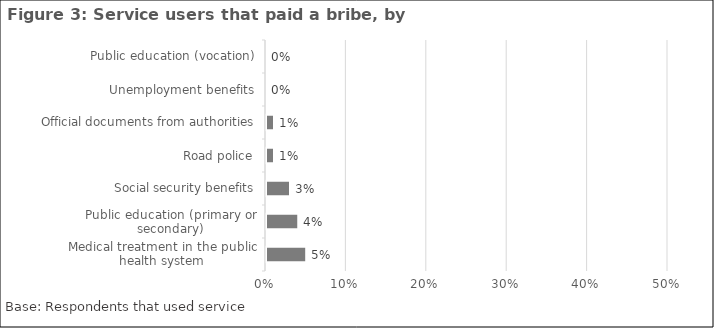
| Category | Series 0 |
|---|---|
| Medical treatment in the public health system | 0.05 |
| Public education (primary or secondary) | 0.04 |
| Social security benefits | 0.03 |
| Road police | 0.01 |
| Official documents from authorities | 0.01 |
| Unemployment benefits | 0 |
| Public education (vocation) | 0 |